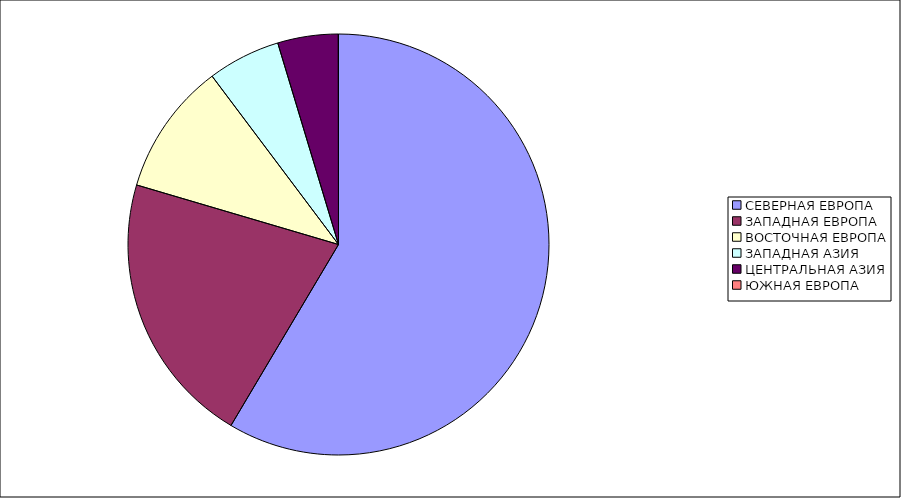
| Category | Оборот |
|---|---|
| СЕВЕРНАЯ ЕВРОПА | 58.531 |
| ЗАПАДНАЯ ЕВРОПА | 21.032 |
| ВОСТОЧНАЯ ЕВРОПА | 10.185 |
| ЗАПАДНАЯ АЗИЯ | 5.592 |
| ЦЕНТРАЛЬНАЯ АЗИЯ | 4.645 |
| ЮЖНАЯ ЕВРОПА | 0.015 |